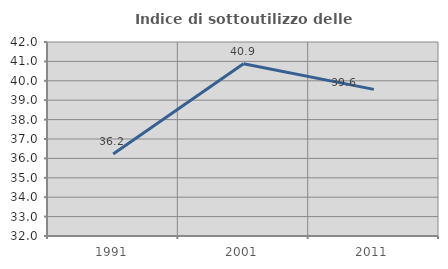
| Category | Indice di sottoutilizzo delle abitazioni  |
|---|---|
| 1991.0 | 36.231 |
| 2001.0 | 40.88 |
| 2011.0 | 39.558 |